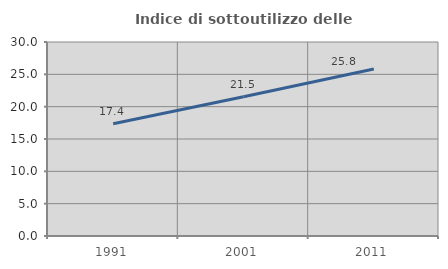
| Category | Indice di sottoutilizzo delle abitazioni  |
|---|---|
| 1991.0 | 17.355 |
| 2001.0 | 21.538 |
| 2011.0 | 25.83 |